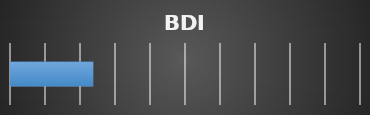
| Category | Series 0 |
|---|---|
| 0 | 23.81 |